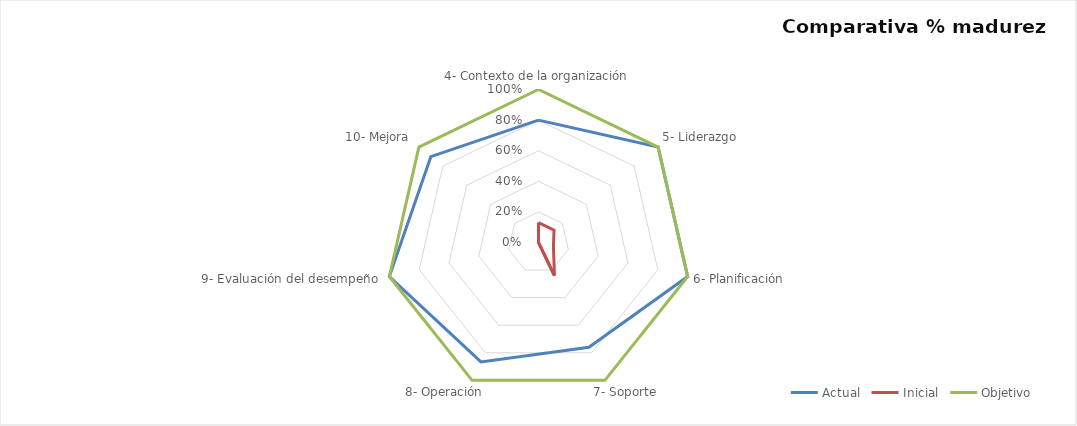
| Category | Actual | Inicial | Objetivo |
|---|---|---|---|
| 4- Contexto de la organización | 0.8 | 0.13 | 1 |
| 5- Liderazgo | 1 | 0.13 | 1 |
| 6- Planificación | 1 | 0.1 | 1 |
| 7- Soporte | 0.76 | 0.24 | 1 |
| 8- Operación | 0.867 | 0 | 1 |
| 9- Evaluación del desempeño | 1 | 0 | 1 |
| 10- Mejora | 0.9 | 0 | 1 |